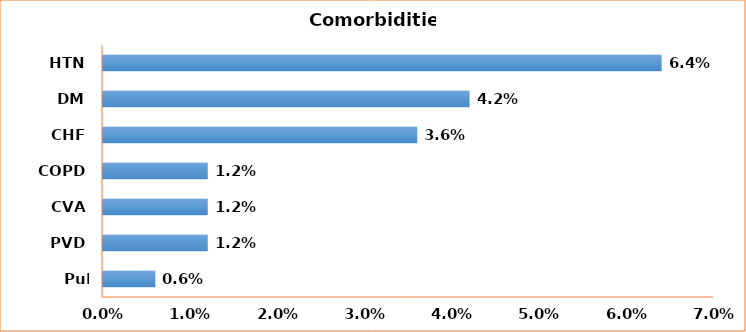
| Category | Series 0 |
|---|---|
| Pul odema | 0.006 |
| PVD | 0.012 |
| CVA | 0.012 |
| COPD | 0.012 |
| CHF | 0.036 |
| DM | 0.042 |
| HTN | 0.064 |